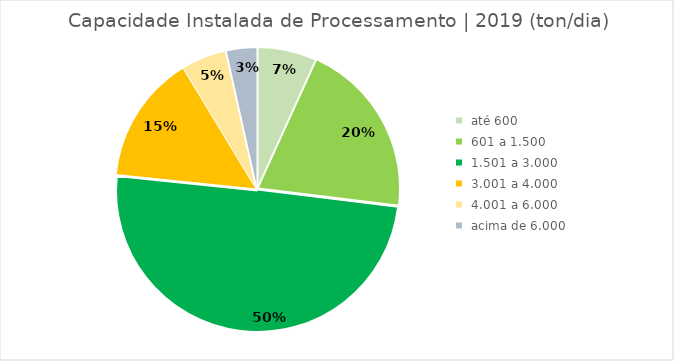
| Category | Series 0 |
|---|---|
|  até 600  | 13038 |
|  601 a 1.500  | 38624 |
|  1.501 a 3.000  | 95330 |
|  3.001 a 4.000  | 28215 |
|  4.001 a 6.000  | 9923 |
|  acima de 6.000  | 6700 |